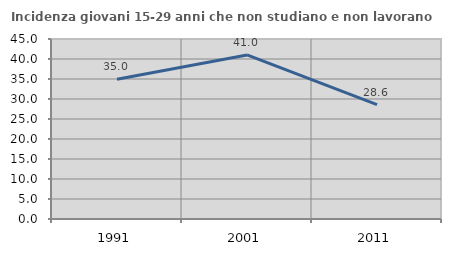
| Category | Incidenza giovani 15-29 anni che non studiano e non lavorano  |
|---|---|
| 1991.0 | 34.951 |
| 2001.0 | 41.011 |
| 2011.0 | 28.617 |